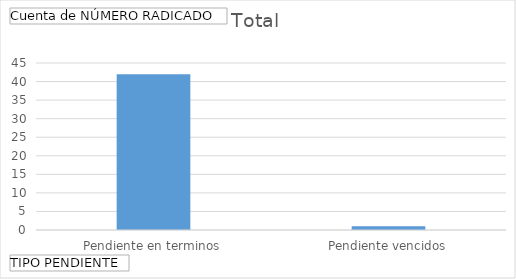
| Category | Total |
|---|---|
| Pendiente en terminos | 42 |
| Pendiente vencidos | 1 |